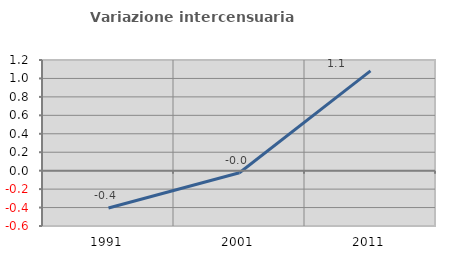
| Category | Variazione intercensuaria annua |
|---|---|
| 1991.0 | -0.405 |
| 2001.0 | -0.023 |
| 2011.0 | 1.082 |